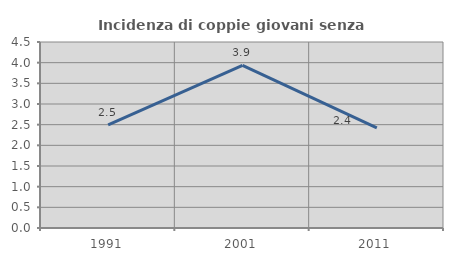
| Category | Incidenza di coppie giovani senza figli |
|---|---|
| 1991.0 | 2.496 |
| 2001.0 | 3.934 |
| 2011.0 | 2.422 |